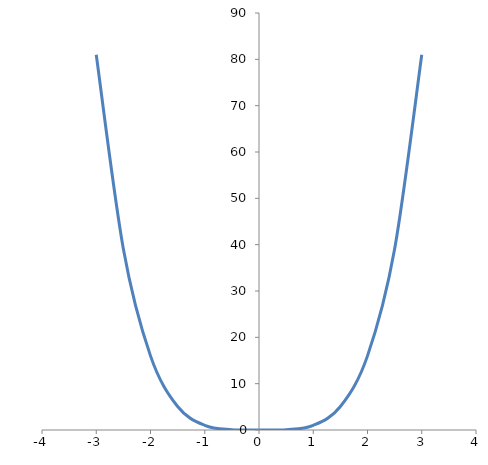
| Category | y |
|---|---|
| -3.0 | 81 |
| -2.5 | 39.062 |
| -2.0 | 16 |
| -1.5 | 5.062 |
| -1.0 | 1 |
| -0.5 | 0.062 |
| 0.0 | 0 |
| 0.5 | 0.062 |
| 1.0 | 1 |
| 1.5 | 5.062 |
| 2.0 | 16 |
| 2.5 | 39.062 |
| 3.0 | 81 |